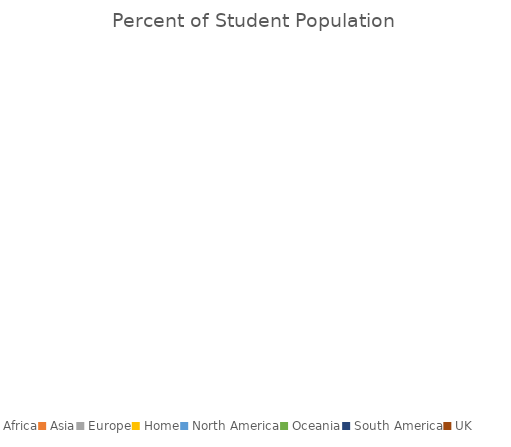
| Category | Percent of Student Population |
|---|---|
| Africa | 0 |
| Asia | 0 |
| Europe | 0 |
| Home | 0 |
| North America | 0 |
| Oceania | 0 |
| South America | 0 |
| UK | 0 |